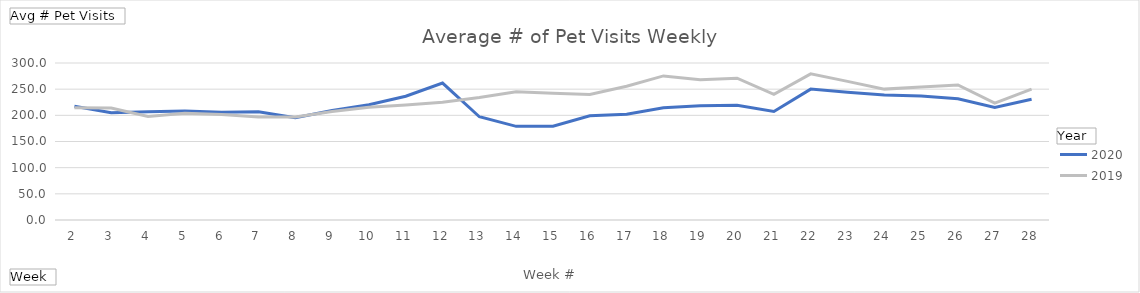
| Category | 2020 | 2019 |
|---|---|---|
| 2 | 217.472 | 214.584 |
| 3 | 204.809 | 213.944 |
| 4 | 206.618 | 197.652 |
| 5 | 208.348 | 204.101 |
| 6 | 205.899 | 201.82 |
| 7 | 206.888 | 196.966 |
| 8 | 195.36 | 196.921 |
| 9 | 209.067 | 207.517 |
| 10 | 220.337 | 215.258 |
| 11 | 236.449 | 219.91 |
| 12 | 261.64 | 225.157 |
| 13 | 197.315 | 234.022 |
| 14 | 178.955 | 245.18 |
| 15 | 179.056 | 242.27 |
| 16 | 199.112 | 239.843 |
| 17 | 202.247 | 255.697 |
| 18 | 214.303 | 275.303 |
| 19 | 218.079 | 268.146 |
| 20 | 219.169 | 271.056 |
| 21 | 207.393 | 239.989 |
| 22 | 250.135 | 279.169 |
| 23 | 244.067 | 264.944 |
| 24 | 238.742 | 250.09 |
| 25 | 236.843 | 254.045 |
| 26 | 231.584 | 258.101 |
| 27 | 215.258 | 223.236 |
| 28 | 230.652 | 249.91 |